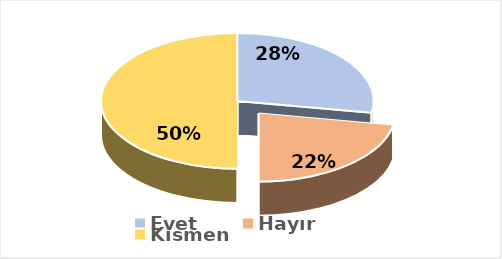
| Category | Evet |
|---|---|
| Evet | 0.278 |
| Hayır | 0.222 |
| Kısmen | 0.5 |